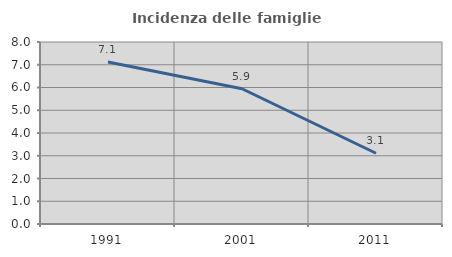
| Category | Incidenza delle famiglie numerose |
|---|---|
| 1991.0 | 7.117 |
| 2001.0 | 5.945 |
| 2011.0 | 3.109 |